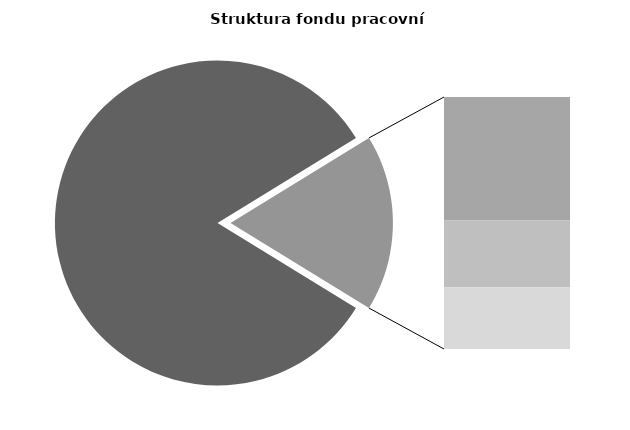
| Category | Series 0 |
|---|---|
| Průměrná měsíční odpracovaná doba bez přesčasu | 139.891 |
| Dovolená | 14.577 |
| Nemoc | 7.894 |
| Jiné | 7.275 |